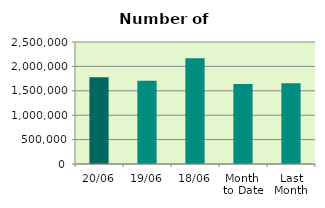
| Category | Series 0 |
|---|---|
| 20/06 | 1779312 |
| 19/06 | 1707066 |
| 18/06 | 2165364 |
| Month 
to Date | 1637732 |
| Last
Month | 1656073.545 |